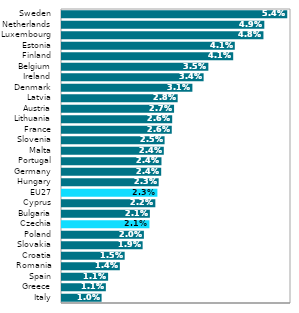
| Category | Series 0 |
|---|---|
| Italy | 0.01 |
| Greece | 0.011 |
| Spain | 0.011 |
| Romania | 0.014 |
| Croatia | 0.015 |
| Slovakia | 0.019 |
| Poland | 0.02 |
| Czechia | 0.021 |
| Bulgaria | 0.021 |
| Cyprus | 0.022 |
| EU27 | 0.023 |
| Hungary | 0.023 |
| Germany | 0.024 |
| Portugal | 0.024 |
| Malta | 0.024 |
| Slovenia | 0.025 |
| France | 0.026 |
| Lithuania | 0.026 |
| Austria | 0.027 |
| Latvia | 0.028 |
| Denmark | 0.031 |
| Ireland | 0.034 |
| Belgium | 0.035 |
| Finland | 0.041 |
| Estonia | 0.041 |
| Luxembourg | 0.048 |
| Netherlands | 0.049 |
| Sweden | 0.054 |